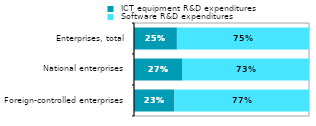
| Category |  ICT equipment R&D expenditures |  Software R&D expenditures |
|---|---|---|
|  Foreign-controlled enterprises | 0.231 | 0.769 |
|  National enterprises | 0.274 | 0.726 |
|  Enterprises, total | 0.245 | 0.755 |